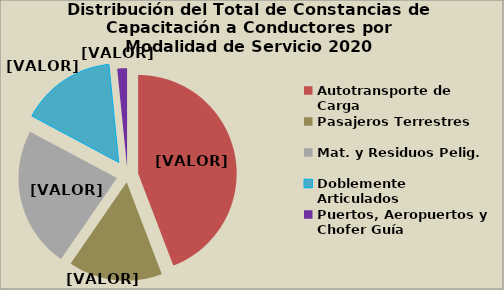
| Category | Series 0 |
|---|---|
| Autotransporte de Carga | 44.194 |
| Pasajeros Terrestres | 15.429 |
| Mat. y Residuos Pelig. | 23.184 |
| Doblemente Articulados | 15.598 |
| Puertos, Aeropuertos y Chofer Guía | 1.595 |